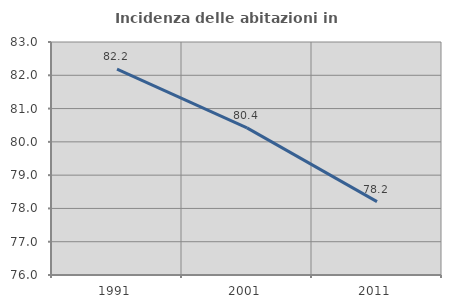
| Category | Incidenza delle abitazioni in proprietà  |
|---|---|
| 1991.0 | 82.182 |
| 2001.0 | 80.419 |
| 2011.0 | 78.205 |